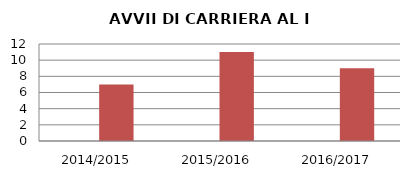
| Category | ANNO | NUMERO |
|---|---|---|
| 2014/2015 | 0 | 7 |
| 2015/2016 | 0 | 11 |
| 2016/2017 | 0 | 9 |